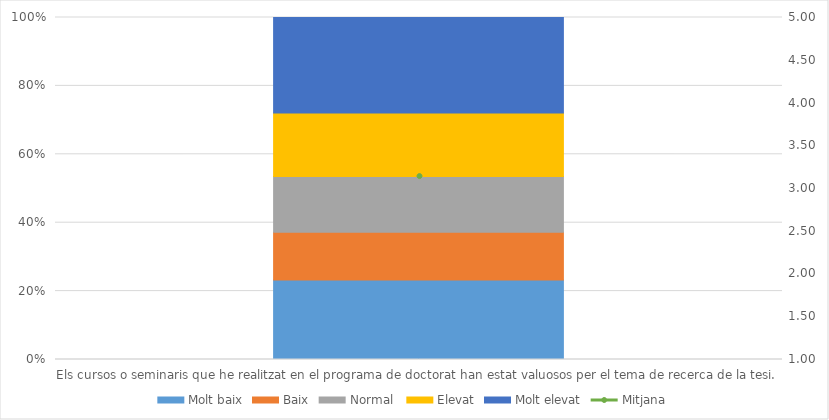
| Category | Molt baix | Baix | Normal  | Elevat | Molt elevat |
|---|---|---|---|---|---|
| Els cursos o seminaris que he realitzat en el programa de doctorat han estat valuosos per el tema de recerca de la tesi. | 10 | 6 | 7 | 8 | 12 |